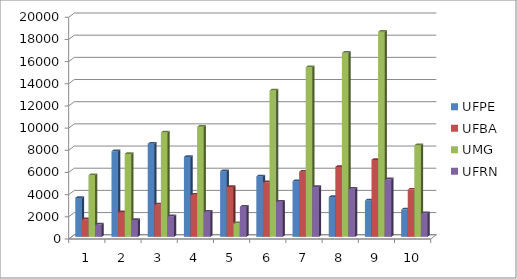
| Category | UFPE | UFBA | UMG | UFRN |
|---|---|---|---|---|
| 0 | 3510 | 1590 | 5560 | 1110 |
| 1 | 7720 | 2220 | 7480 | 1520 |
| 2 | 8400 | 2920 | 9420 | 1860 |
| 3 | 7210 | 3800 | 9930 | 2270 |
| 4 | 5920 | 4500 | 1220 | 2720 |
| 5 | 5450 | 4920 | 13200 | 3160 |
| 6 | 5020 | 5870 | 15300 | 4490 |
| 7 | 3590 | 6310 | 16600 | 4340 |
| 8 | 3280 | 6940 | 18500 | 5190 |
| 9 | 2460 | 4260 | 8260 | 2128 |